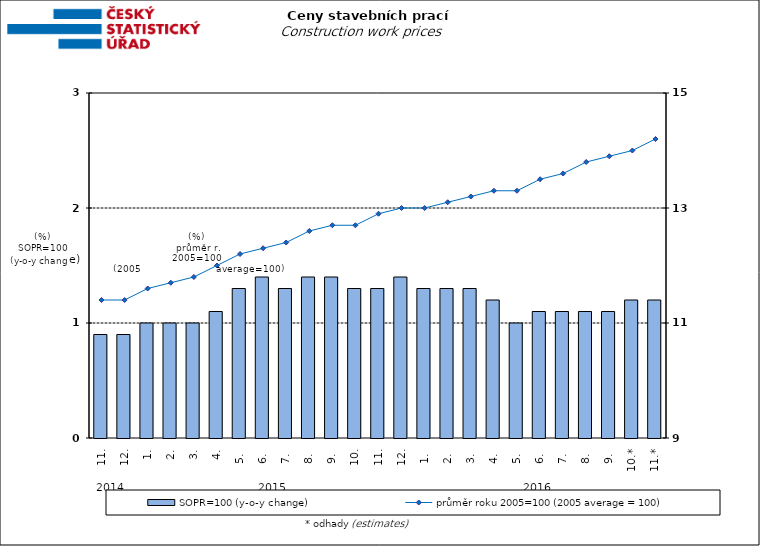
| Category | SOPR=100 (y-o-y change)   |
|---|---|
| 0 | 0.9 |
| 1 | 0.9 |
| 2 | 1 |
| 3 | 1 |
| 4 | 1 |
| 5 | 1.1 |
| 6 | 1.3 |
| 7 | 1.4 |
| 8 | 1.3 |
| 9 | 1.4 |
| 10 | 1.4 |
| 11 | 1.3 |
| 12 | 1.3 |
| 13 | 1.4 |
| 14 | 1.3 |
| 15 | 1.3 |
| 16 | 1.3 |
| 17 | 1.2 |
| 18 | 1 |
| 19 | 1.1 |
| 20 | 1.1 |
| 21 | 1.1 |
| 22 | 1.1 |
| 23 | 1.2 |
| 24 | 1.2 |